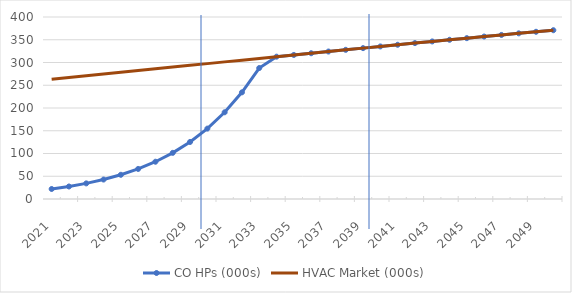
| Category | CO HPs (000s) | HVAC Market (000s) |
|---|---|---|
| 2021.0 | 22 | 263.031 |
| 2022.0 | 27.5 | 266.854 |
| 2023.0 | 34.32 | 270.683 |
| 2024.0 | 42.763 | 274.517 |
| 2025.0 | 53.197 | 278.354 |
| 2026.0 | 66.07 | 282.193 |
| 2027.0 | 81.927 | 286.032 |
| 2028.0 | 101.426 | 289.869 |
| 2029.0 | 125.363 | 293.705 |
| 2030.0 | 154.697 | 297.536 |
| 2031.0 | 190.587 | 301.362 |
| 2032.0 | 234.422 | 305.181 |
| 2033.0 | 287.871 | 308.992 |
| 2034.0 | 312.792 | 312.792 |
| 2035.0 | 316.581 | 316.581 |
| 2036.0 | 320.357 | 320.357 |
| 2037.0 | 324.118 | 324.118 |
| 2038.0 | 327.863 | 327.863 |
| 2039.0 | 331.59 | 331.59 |
| 2040.0 | 335.298 | 335.298 |
| 2041.0 | 338.984 | 338.984 |
| 2042.0 | 342.648 | 342.648 |
| 2043.0 | 346.288 | 346.288 |
| 2044.0 | 349.902 | 349.902 |
| 2045.0 | 353.488 | 353.488 |
| 2046.0 | 357.046 | 357.046 |
| 2047.0 | 360.572 | 360.572 |
| 2048.0 | 364.066 | 364.066 |
| 2049.0 | 367.526 | 367.526 |
| 2050.0 | 370.951 | 370.951 |